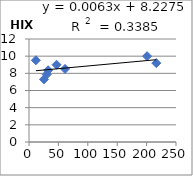
| Category | HIX |
|---|---|
| 25.5 | 7.3 |
| 61.3 | 8.51 |
| 11.7 | 9.52 |
| 216.5 | 9.19 |
| 46.8 | 9 |
| 32.5 | 8.36 |
| 200.8 | 10 |
| 30.1 | 7.87 |